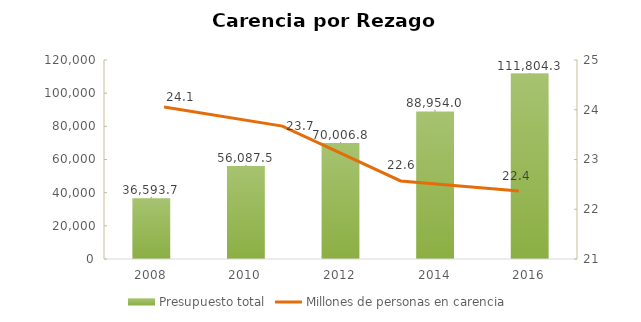
| Category | Presupuesto total |
|---|---|
| 2008.0 | 36593737101.11 |
| 2010.0 | 56087528871.098 |
| 2012.0 | 70006790514.163 |
| 2014.0 | 88953963618.68 |
| 2016.0 | 111804338744 |